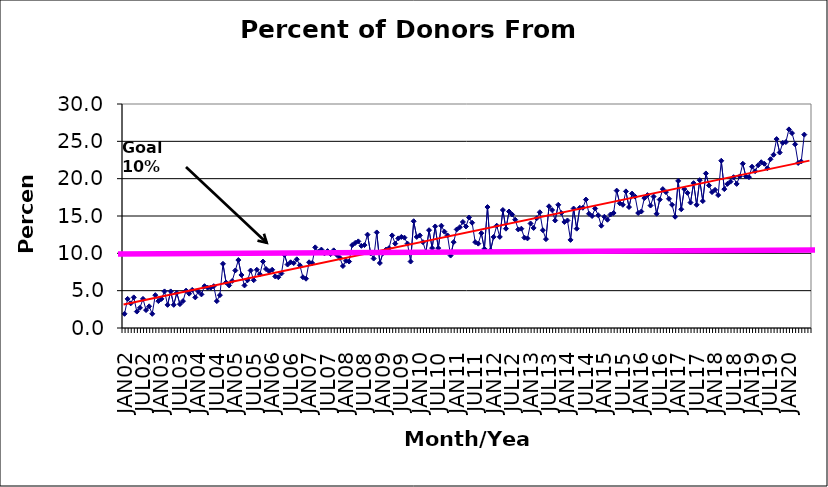
| Category | Series 0 |
|---|---|
| JAN02 | 1.9 |
| FEB02 | 3.9 |
| MAR02 | 3.3 |
| APR02 | 4.1 |
| MAY02 | 2.2 |
| JUN02 | 2.7 |
| JUL02 | 3.9 |
| AUG02 | 2.4 |
| SEP02 | 2.9 |
| OCT02 | 1.9 |
| NOV02 | 4.4 |
| DEC02 | 3.6 |
| JAN03 | 3.9 |
| FEB03 | 4.9 |
| MAR03 | 3.1 |
| APR03 | 4.9 |
| MAY03 | 3.1 |
| JUN03 | 4.7 |
| JUL03 | 3.2 |
| AUG03 | 3.6 |
| SEP03 | 5 |
| OCT03 | 4.6 |
| NOV03 | 5.1 |
| DEC03 | 4.1 |
| JAN04 | 4.9 |
| FEB04 | 4.5 |
| MAR04 | 5.6 |
| APR04 | 5.4 |
| MAY04 | 5.4 |
| JUN04 | 5.6 |
| JUL04 | 3.6 |
| AUG04 | 4.4 |
| SEP04 | 8.6 |
| OCT04 | 6.1 |
| NOV04 | 5.7 |
| DEC04 | 6.3 |
| JAN05 | 7.7 |
| FEB05 | 9.1 |
| MAR05 | 7.1 |
| APR05 | 5.7 |
| MAY05 | 6.4 |
| JUN05 | 7.7 |
| JUL05 | 6.4 |
| AUG05 | 7.8 |
| SEP05 | 7.2 |
| OCT05 | 8.9 |
| NOV05 | 7.9 |
| DEC05 | 7.6 |
| JAN06 | 7.8 |
| FEB06 | 6.9 |
| MAR06 | 6.8 |
| APR06 | 7.3 |
| MAY06 | 9.8 |
| JUN06 | 8.5 |
| JUL06 | 8.8 |
| AUG06 | 8.7 |
| SEP06 | 9.2 |
| OCT06 | 8.4 |
| NOV06 | 6.8 |
| DEC06 | 6.6 |
| JAN07 | 8.8 |
| FEB07 | 8.7 |
| MAR07 | 10.8 |
| APR07 | 10.2 |
| MAY07 | 10.5 |
| JUN07 | 10 |
| JUL07 | 10.3 |
| AUG07 | 9.9 |
| SEP07 | 10.4 |
| OCT07 | 9.8 |
| NOV07 | 9.4 |
| DEC07 | 8.3 |
| JAN08 | 9 |
| FEB08 | 8.9 |
| MAR08 | 11.1 |
| APR08 | 11.4 |
| MAY08 | 11.6 |
| JUN08 | 11 |
| JUL08 | 11.1 |
| AUG08 | 12.5 |
| SEP08 | 10 |
| OCT08 | 9.3 |
| NOV08 | 12.8 |
| DEC08 | 8.7 |
| JAN09 | 10 |
| FEB09 | 10.5 |
| MAR09 | 10.7 |
| APR09 | 12.4 |
| MAY09 | 11.3 |
| JUN09 | 12 |
| JUL09 | 12.2 |
| AUG09 | 12.1 |
| SEP09 | 11.3 |
| OCT09 | 8.9 |
| NOV09 | 14.3 |
| DEC09 | 12.2 |
| JAN10 | 12.4 |
| FEB10 | 11.5 |
| MAR10 | 10.2 |
| APR10 | 13.1 |
| MAY10 | 10.7 |
| JUN10 | 13.6 |
| JUL10 | 10.7 |
| AUG10 | 13.7 |
| SEP10 | 12.9 |
| OCT10 | 12.4 |
| NOV10 | 9.7 |
| DEC10 | 11.5 |
| JAN11 | 13.2 |
| FEB11 | 13.5 |
| MAR11 | 14.2 |
| APR11 | 13.6 |
| MAY11 | 14.8 |
| JUN11 | 14.1 |
| JUL11 | 11.5 |
| AUG11 | 11.3 |
| SEP11 | 12.7 |
| OCT11 | 10.6 |
| NOV11 | 16.2 |
| DEC11 | 10.4 |
| JAN12 | 12.2 |
| FEB12 | 13.7 |
| MAR12 | 12.2 |
| APR12 | 15.8 |
| MAY12 | 13.3 |
| JUN12 | 15.6 |
| JUL12 | 15.2 |
| AUG12 | 14.5 |
| SEP12 | 13.2 |
| OCT12 | 13.3 |
| NOV12 | 12.1 |
| DEC12 | 12 |
| JAN13 | 14 |
| FEB13 | 13.4 |
| MAR13 | 14.7 |
| APR13 | 15.5 |
| MAY13 | 13.1 |
| JUN13 | 11.9 |
| JUL13 | 16.3 |
| AUG13 | 15.8 |
| SEP13 | 14.4 |
| OCT13 | 16.5 |
| NOV13 | 15.4 |
| DEC13 | 14.2 |
| JAN14 | 14.4 |
| FEB14 | 11.8 |
| MAR14 | 16 |
| APR14 | 13.3 |
| MAY14 | 16.1 |
| JUN14 | 16.1 |
| JUL14 | 17.2 |
| AUG14 | 15.3 |
| SEP14 | 15 |
| OCT14 | 16 |
| NOV14 | 15.1 |
| DEC14 | 13.7 |
| JAN15 | 14.9 |
| FEB15 | 14.5 |
| MAR15 | 15.2 |
| APR15 | 15.4 |
| MAY15 | 18.4 |
| JUN15 | 16.7 |
| JUL15 | 16.5 |
| AUG15 | 18.3 |
| SEP15 | 16.2 |
| OCT15 | 18 |
| NOV15 | 17.6 |
| DEC15 | 15.4 |
| JAN16 | 15.6 |
| FEB16 | 17.4 |
| MAR16 | 17.8 |
| APR16 | 16.4 |
| MAY16 | 17.6 |
| JUN16 | 15.3 |
| JUL16 | 17.2 |
| AUG16 | 18.6 |
| SEP16 | 18.2 |
| OCT16 | 17.3 |
| NOV16 | 16.5 |
| DEC16 | 14.9 |
| JAN17 | 19.7 |
| FEB17 | 15.9 |
| MAR17 | 18.6 |
| APR17 | 18.1 |
| MAY17 | 16.8 |
| JUN17 | 19.4 |
| JUL17 | 16.5 |
| AUG17 | 19.8 |
| SEP17 | 17 |
| OCT17 | 20.7 |
| NOV17 | 19.1 |
| DEC17 | 18.2 |
| JAN18 | 18.5 |
| FEB18 | 17.8 |
| MAR18 | 22.4 |
| APR18 | 18.6 |
| MAY18 | 19.3 |
| JUN18 | 19.6 |
| JUL18 | 20.2 |
| AUG18 | 19.3 |
| SEP18 | 20.3 |
| OCT18 | 22 |
| NOV18 | 20.3 |
| DEC18 | 20.2 |
| JAN19 | 21.6 |
| FEB19 | 21 |
| MAR19 | 21.8 |
| APR19 | 22.2 |
| MAY19 | 22 |
| JUN19 | 21.4 |
| JUL19 | 22.6 |
| AUG19 | 23.2 |
| SEP19 | 25.3 |
| OCT19 | 23.5 |
| NOV19 | 24.8 |
| DEC19 | 24.9 |
| JAN20 | 26.6 |
| FEB20 | 26.1 |
| MAR20 | 24.6 |
| APR20 | 22.1 |
| MAY20 | 22.3 |
| JUN20 | 25.9 |